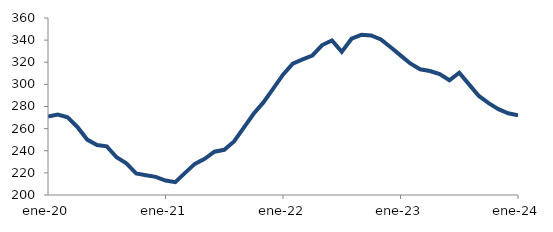
| Category | Series 0 |
|---|---|
| 2020-01-01 | 270.858 |
| 2020-02-01 | 272.678 |
| 2020-03-01 | 270.182 |
| 2020-04-01 | 261.514 |
| 2020-05-01 | 250.092 |
| 2020-06-01 | 245.154 |
| 2020-07-01 | 243.995 |
| 2020-08-01 | 234.063 |
| 2020-09-01 | 228.636 |
| 2020-10-01 | 219.498 |
| 2020-11-01 | 217.84 |
| 2020-12-01 | 216.368 |
| 2021-01-01 | 213.087 |
| 2021-02-01 | 211.643 |
| 2021-03-01 | 220.04 |
| 2021-04-01 | 228.12 |
| 2021-05-01 | 232.717 |
| 2021-06-01 | 239.097 |
| 2021-07-01 | 240.846 |
| 2021-08-01 | 248.449 |
| 2021-09-01 | 260.934 |
| 2021-10-01 | 273.441 |
| 2021-11-01 | 283.683 |
| 2021-12-01 | 296.134 |
| 2022-01-01 | 308.804 |
| 2022-02-01 | 318.726 |
| 2022-03-01 | 322.592 |
| 2022-04-01 | 326.114 |
| 2022-05-01 | 335.557 |
| 2022-06-01 | 339.684 |
| 2022-07-01 | 329.357 |
| 2022-08-01 | 341.293 |
| 2022-09-01 | 344.793 |
| 2022-10-01 | 344.185 |
| 2022-11-01 | 340.608 |
| 2022-12-01 | 333.559 |
| 2023-01-01 | 326.199 |
| 2023-02-01 | 318.915 |
| 2023-03-01 | 313.615 |
| 2023-04-01 | 312.076 |
| 2023-05-01 | 309.232 |
| 2023-06-01 | 303.714 |
| 2023-07-01 | 310.493 |
| 2023-08-01 | 299.987 |
| 2023-09-01 | 289.543 |
| 2023-10-01 | 283.093 |
| 2023-11-01 | 277.645 |
| 2023-12-01 | 273.863 |
| 2024-01-01 | 272.122 |